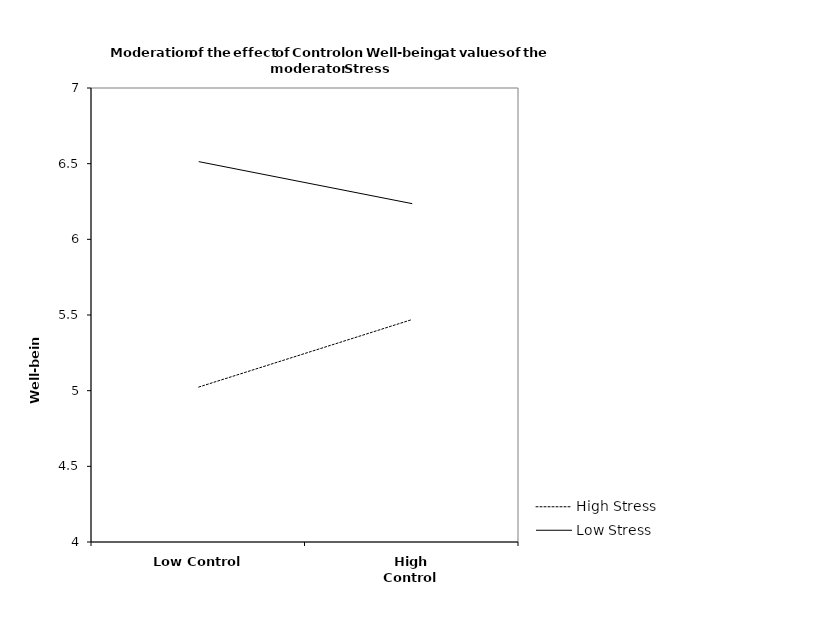
| Category | High Stress | Low Stress |
|---|---|---|
| Low Control | 5.024 | 6.513 |
| High Control | 5.47 | 6.236 |